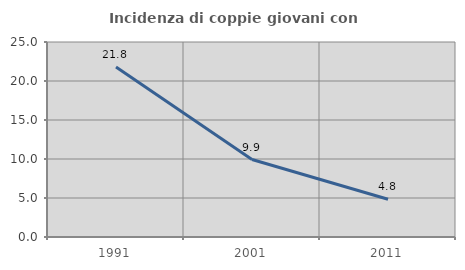
| Category | Incidenza di coppie giovani con figli |
|---|---|
| 1991.0 | 21.793 |
| 2001.0 | 9.933 |
| 2011.0 | 4.843 |